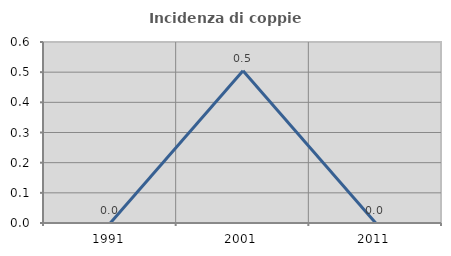
| Category | Incidenza di coppie miste |
|---|---|
| 1991.0 | 0 |
| 2001.0 | 0.505 |
| 2011.0 | 0 |